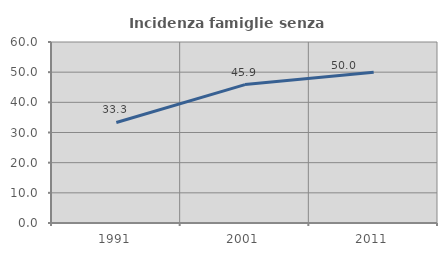
| Category | Incidenza famiglie senza nuclei |
|---|---|
| 1991.0 | 33.333 |
| 2001.0 | 45.876 |
| 2011.0 | 50 |